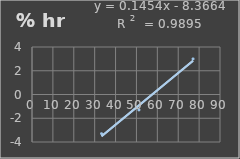
| Category | Humedad |
|---|---|
| 33.3 | -3.3 |
| 51.2 | -1.3 |
| 77.1 | 3 |